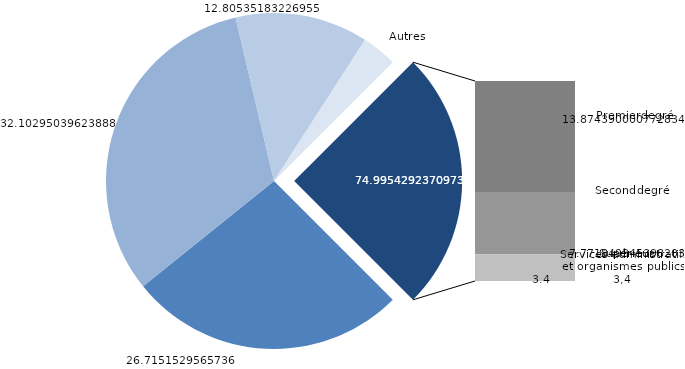
| Category | Series 0 |
|---|---|
| Établissements publics du premier degré | 40250.2 |
| Établissements publics du second degré | 48367.688 |
| Établissements publics du supérieur | 19293.095 |
| Autres établissements publics | 5080.361 |
| Établissements privés subventionnés | 20903.753 |
| Établissements privés non subventionnés | 11709.403 |
| Services administratifs et organismes publics | 5059.807 |